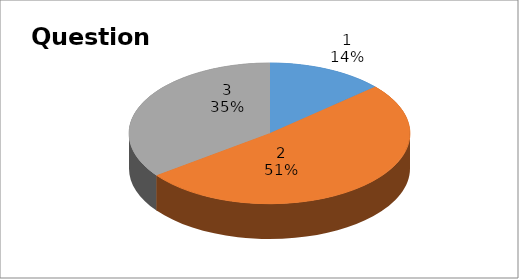
| Category | Series 0 |
|---|---|
| 0 | 5 |
| 1 | 19 |
| 2 | 13 |